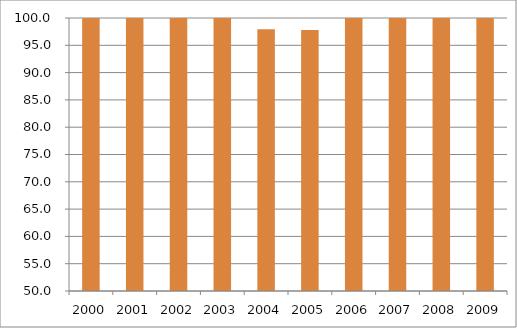
| Category | Brasil |
|---|---|
| 2000.0 | 101.44 |
| 2001.0 | 102.83 |
| 2002.0 | 100.01 |
| 2003.0 | 100.48 |
| 2004.0 | 97.93 |
| 2005.0 | 97.81 |
| 2006.0 | 102.02 |
| 2007.0 | 104.88 |
| 2008.0 | 100.12 |
| 2009.0 | 100.92 |